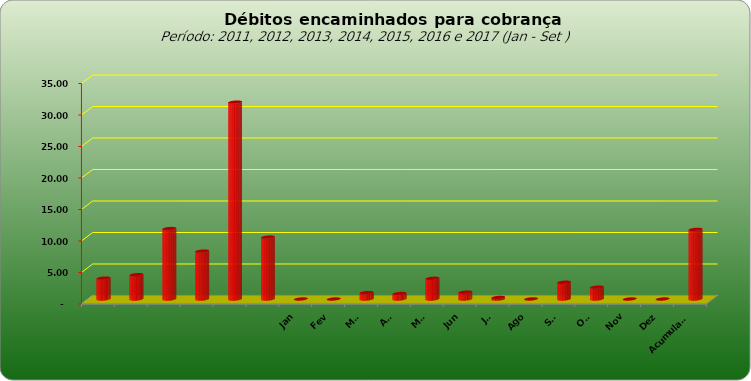
| Category |  3.309.443,02  |
|---|---|
|  | 3309443.02 |
|  | 3859728.44 |
|  | 11181928.25 |
|  | 7600526.01 |
|  | 31248623.5 |
|  | 9830198.34 |
| Jan | 0 |
| Fev | 0 |
| Mar | 1019401.01 |
| Abr | 870947.61 |
| Mai | 3287717.74 |
| Jun | 1079067.67 |
| Jul | 249791.68 |
| Ago | 11185.15 |
| Set | 2660962.69 |
| Out | 1876916.46 |
| Nov | 0 |
| Dez | 0 |
| Acumulado | 11055990.01 |